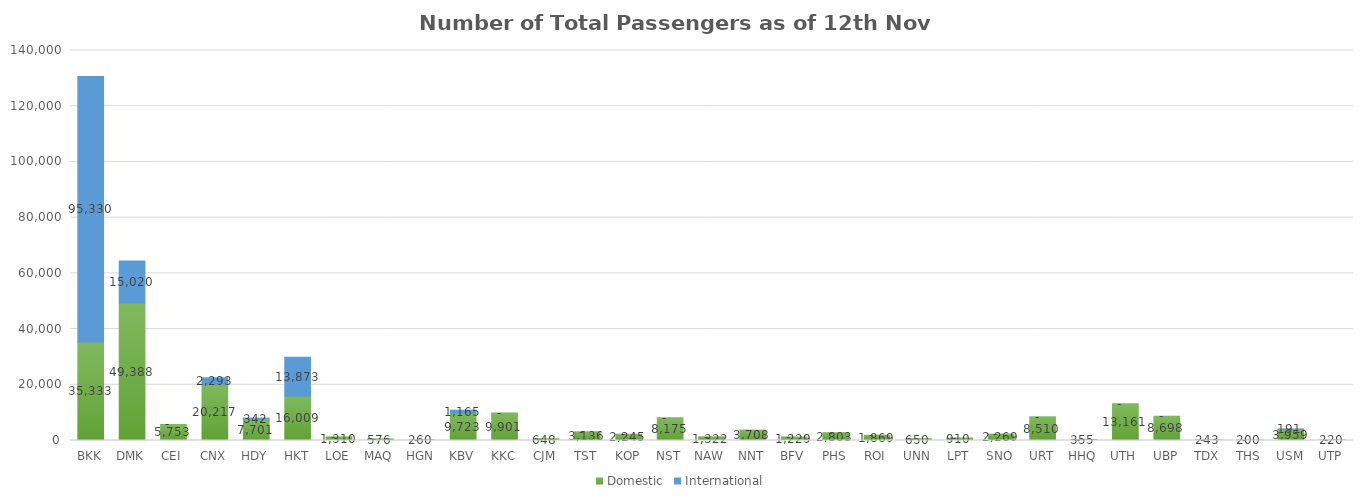
| Category | Domestic | International |
|---|---|---|
| BKK | 35333 | 95330 |
| DMK | 49388 | 15020 |
| CEI | 5753 | 0 |
| CNX | 20217 | 2293 |
| HDY | 7701 | 342 |
| HKT | 16009 | 13873 |
| LOE | 1310 | 0 |
| MAQ | 576 | 0 |
| HGN | 260 | 0 |
| KBV | 9723 | 1165 |
| KKC | 9901 | 0 |
| CJM | 648 | 0 |
| TST | 3136 | 0 |
| KOP | 2245 | 0 |
| NST | 8175 | 0 |
| NAW | 1322 | 0 |
| NNT | 3708 | 0 |
| BFV | 1229 | 0 |
| PHS | 2803 | 0 |
| ROI | 1869 | 0 |
| UNN | 650 | 0 |
| LPT | 910 | 0 |
| SNO | 2269 | 0 |
| URT | 8510 | 0 |
| HHQ | 355 | 0 |
| UTH | 13161 | 0 |
| UBP | 8698 | 0 |
| TDX | 243 | 0 |
| THS | 200 | 0 |
| USM | 3959 | 191 |
| UTP | 220 | 0 |